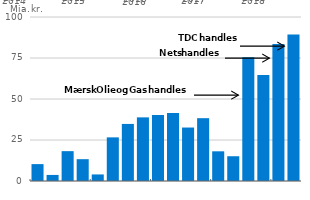
| Category | Udenlandske egenkapital-
investeringer i Danmark |
|---|---|
| 0 | 10.3 |
| 1 | 3.7 |
| 2 | 18.2 |
| 3 | 13.3 |
| 4 | 4 |
| 5 | 26.6 |
| 6 | 34.8 |
| 7 | 38.8 |
| 8 | 40.3 |
| 9 | 41.4 |
| 10 | 32.6 |
| 11 | 38.3 |
| 12 | 18.1 |
| 13 | 15.1 |
| 14 | 75.5 |
| 15 | 64.7 |
| 16 | 83.5 |
| 17 | 89.4 |